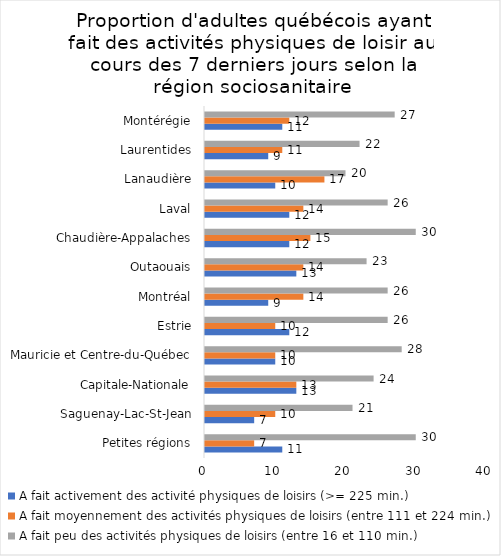
| Category | A fait activement des activité physiques de loisirs (>= 225 min.) | A fait moyennement des activités physiques de loisirs (entre 111 et 224 min.) | A fait peu des activités physiques de loisirs (entre 16 et 110 min.) |
|---|---|---|---|
| Petites régions | 11 | 7 | 30 |
| Saguenay-Lac-St-Jean | 7 | 10 | 21 |
| Capitale-Nationale | 13 | 13 | 24 |
| Mauricie et Centre-du-Québec | 10 | 10 | 28 |
| Estrie | 12 | 10 | 26 |
| Montréal | 9 | 14 | 26 |
| Outaouais | 13 | 14 | 23 |
| Chaudière-Appalaches | 12 | 15 | 30 |
| Laval | 12 | 14 | 26 |
| Lanaudière | 10 | 17 | 20 |
| Laurentides | 9 | 11 | 22 |
| Montérégie | 11 | 12 | 27 |